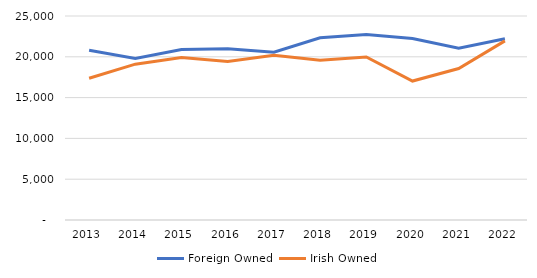
| Category | Foreign Owned | Irish Owned |
|---|---|---|
| 2013 | 20800 | 17377 |
| 2014 | 19808 | 19100 |
| 2015 | 20898 | 19902 |
| 2016 | 20975 | 19423 |
| 2017 | 20559 | 20202 |
| 2018 | 22326 | 19583 |
| 2019 | 22732 | 19981 |
| 2020 | 22247 | 17027 |
| 2021 | 21041 | 18563 |
| 2022 | 22211 | 21955 |